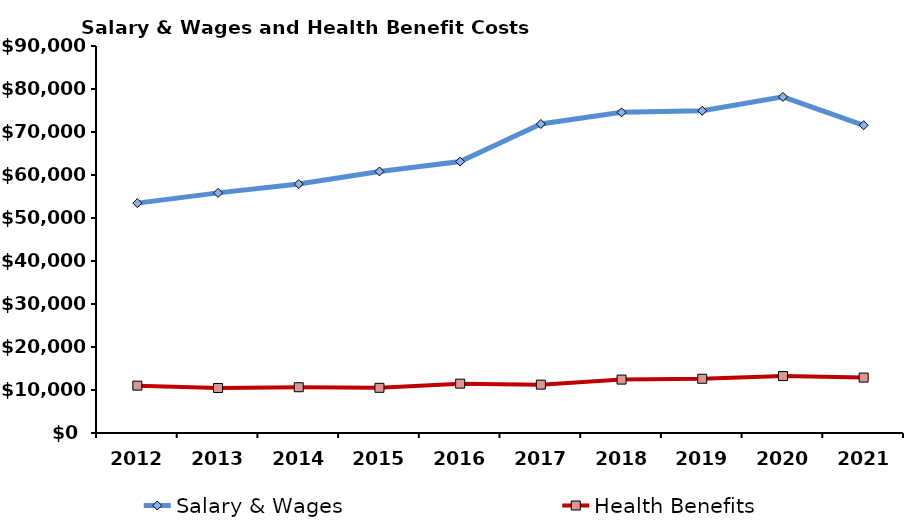
| Category | Salary & Wages | Health Benefits |
|---|---|---|
| 2012.0 | 53460.77 | 11010.375 |
| 2013.0 | 55842.859 | 10468.304 |
| 2014.0 | 57896.129 | 10644.784 |
| 2015.0 | 60818.822 | 10505.447 |
| 2016.0 | 63115.849 | 11476.868 |
| 2017.0 | 71872.605 | 11248.074 |
| 2018.0 | 74567.584 | 12420.148 |
| 2019.0 | 74933.908 | 12613.789 |
| 2020.0 | 78161.277 | 13243.018 |
| 2021.0 | 71564.593 | 12887.423 |